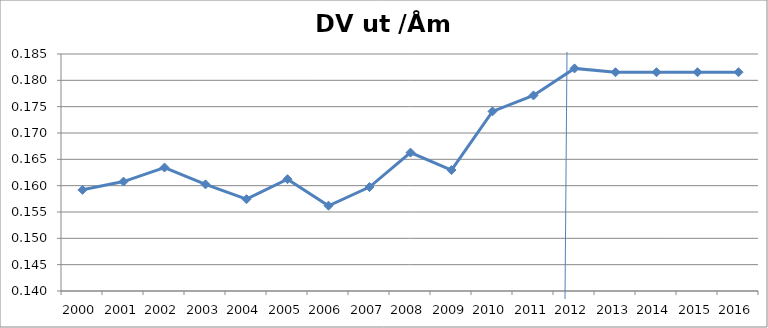
| Category | DV ut /Åm in |
|---|---|
| 2000.0 | 0.159 |
| 2001.0 | 0.161 |
| 2002.0 | 0.163 |
| 2003.0 | 0.16 |
| 2004.0 | 0.157 |
| 2005.0 | 0.161 |
| 2006.0 | 0.156 |
| 2007.0 | 0.16 |
| 2008.0 | 0.166 |
| 2009.0 | 0.163 |
| 2010.0 | 0.174 |
| 2011.0 | 0.177 |
| 2012.0 | 0.182 |
| 2013.0 | 0.182 |
| 2014.0 | 0.182 |
| 2015.0 | 0.182 |
| 2016.0 | 0.182 |